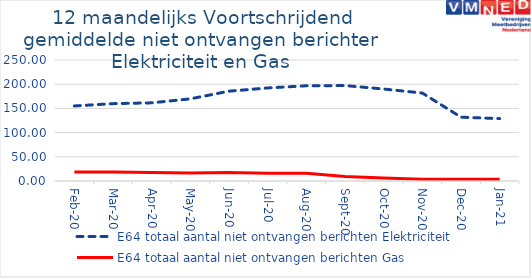
| Category | E64 totaal aantal niet ontvangen berichten Elektriciteit | E64 totaal aantal niet ontvangen berichten Gas |
|---|---|---|
| 2020-02-01 | 155.083 | 18.667 |
| 2020-03-01 | 159.833 | 18.667 |
| 2020-04-01 | 161.5 | 17.75 |
| 2020-05-01 | 169.75 | 16.75 |
| 2020-06-01 | 185.583 | 17.75 |
| 2020-07-01 | 192.25 | 16.25 |
| 2020-08-01 | 196.75 | 15.833 |
| 2020-09-01 | 197.167 | 9.5 |
| 2020-10-01 | 190.083 | 6.417 |
| 2020-11-01 | 181.75 | 3.75 |
| 2020-12-01 | 131.833 | 3.5 |
| 2021-01-01 | 128.917 | 3.75 |